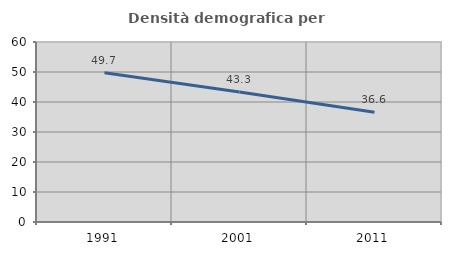
| Category | Densità demografica |
|---|---|
| 1991.0 | 49.722 |
| 2001.0 | 43.339 |
| 2011.0 | 36.581 |